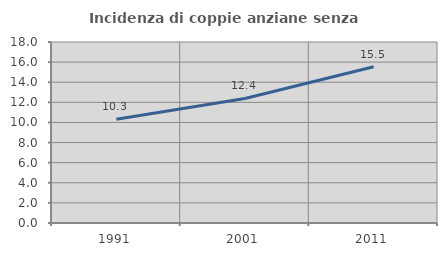
| Category | Incidenza di coppie anziane senza figli  |
|---|---|
| 1991.0 | 10.317 |
| 2001.0 | 12.385 |
| 2011.0 | 15.544 |